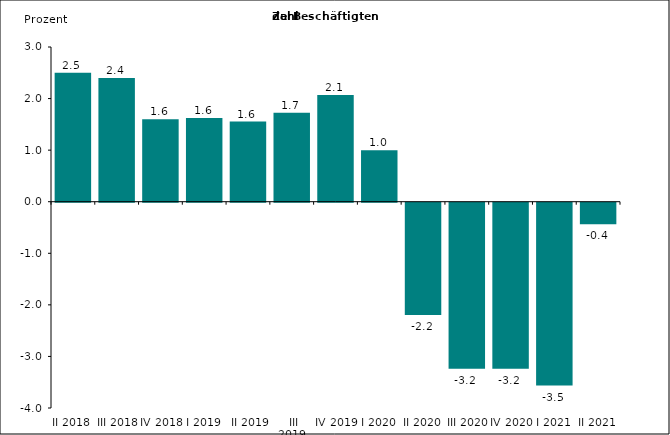
| Category | Series 0 |
|---|---|
| II 2018 | 2.5 |
| III 2018 | 2.4 |
| IV 2018 | 1.6 |
| I 2019 | 1.626 |
|  II 2019 | 1.554 |
|  III 2019 | 1.726 |
| IV 2019 | 2.07 |
| I 2020 | 1 |
| II 2020 | -2.176 |
| III 2020 | -3.218 |
| IV 2020 | -3.22 |
| I 2021 | -3.546 |
| II 2021 | -0.419 |